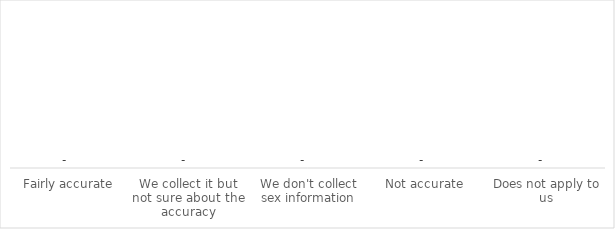
| Category | Series 0 |
|---|---|
| Fairly accurate | 0 |
| We collect it but not sure about the accuracy | 0 |
| We don't collect sex information | 0 |
| Not accurate | 0 |
| Does not apply to us | 0 |